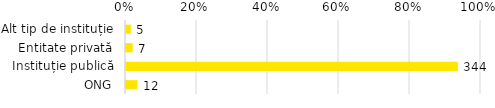
| Category | Total |
|---|---|
| Alt tip de instituție | 0.014 |
| Entitate privată | 0.019 |
| Instituție publică | 0.935 |
| ONG | 0.033 |